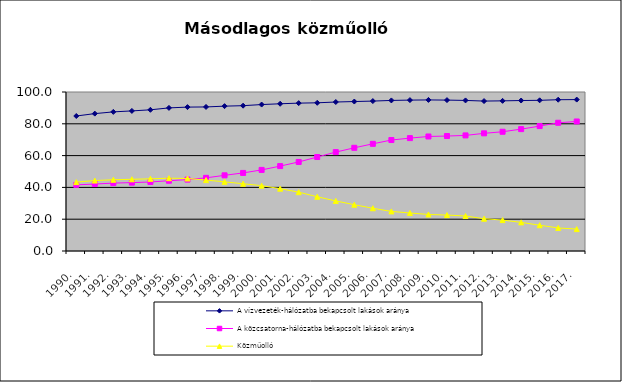
| Category | A vízvezeték-hálózatba bekapcsolt lakások aránya | A közcsatorna-hálózatba bekapcsolt lakások aránya | Közműolló |
|---|---|---|---|
| 1990. | 84.9 | 41.6 | 43.3 |
| 1991. | 86.4 | 42.1 | 44.3 |
| 1992. | 87.5 | 42.7 | 44.8 |
| 1993. | 88.1 | 43 | 45.1 |
| 1994. | 88.8 | 43.4 | 45.4 |
| 1995. | 90 | 44.2 | 45.8 |
| 1996. | 90.5 | 44.9 | 45.6 |
| 1997. | 90.6 | 46 | 44.6 |
| 1998. | 91.1 | 47.6 | 43.5 |
| 1999. | 91.4 | 49.1 | 42.3 |
| 2000. | 92.1 | 51 | 41.1 |
| 2001. | 92.6 | 53.4 | 39.2 |
| 2002. | 93 | 56 | 37 |
| 2003. | 93.2 | 59.1 | 34.1 |
| 2004. | 93.7 | 62.2 | 31.5 |
| 2005. | 94 | 64.9 | 29.1 |
| 2006. | 94.285 | 67.4 | 26.885 |
| 2007. | 94.7 | 69.8 | 24.9 |
| 2008. | 94.906 | 70.999 | 23.907 |
| 2009. | 95.012 | 72.031 | 22.981 |
| 2010. | 94.9 | 72.298 | 22.601 |
| 2011. | 94.7 | 72.7 | 22 |
| 2012. | 94.3 | 74 | 20.3 |
| 2013. | 94.432 | 74.994 | 19.438 |
| 2014. | 94.639 | 76.643 | 17.995 |
| 2015. | 94.772 | 78.558 | 16.213 |
| 2016. | 95.15 | 80.651 | 14.499 |
| 2017. | 95.234 | 81.458 | 13.776 |